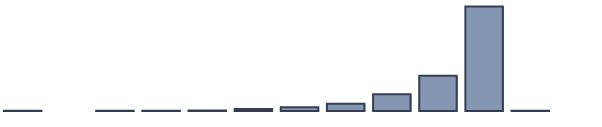
| Category | Series 0 |
|---|---|
| 0 | 0.2 |
| 1 | 0 |
| 2 | 0.1 |
| 3 | 0.1 |
| 4 | 0.3 |
| 5 | 1.2 |
| 6 | 2.2 |
| 7 | 4.2 |
| 8 | 9.8 |
| 9 | 20.6 |
| 10 | 61.2 |
| 11 | 0.1 |
| 12 | 0 |